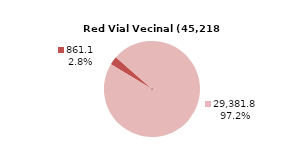
| Category | RV Vecinal |
|---|---|
| Pavimentada | 861.06 |
| No Pavimentada | 29381.767 |